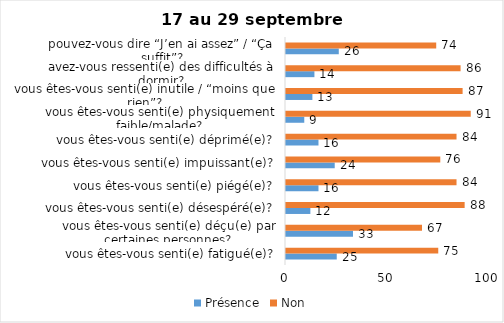
| Category | Présence | Non |
|---|---|---|
| vous êtes-vous senti(e) fatigué(e)? | 25 | 75 |
| vous êtes-vous senti(e) déçu(e) par certaines personnes? | 33 | 67 |
| vous êtes-vous senti(e) désespéré(e)? | 12 | 88 |
| vous êtes-vous senti(e) piégé(e)? | 16 | 84 |
| vous êtes-vous senti(e) impuissant(e)? | 24 | 76 |
| vous êtes-vous senti(e) déprimé(e)? | 16 | 84 |
| vous êtes-vous senti(e) physiquement faible/malade? | 9 | 91 |
| vous êtes-vous senti(e) inutile / “moins que rien”? | 13 | 87 |
| avez-vous ressenti(e) des difficultés à dormir? | 14 | 86 |
| pouvez-vous dire “J’en ai assez” / “Ça suffit”? | 26 | 74 |